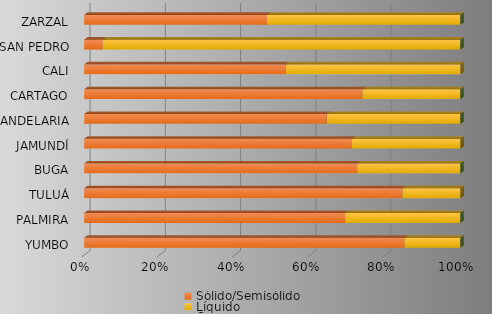
| Category | Sólido/Semisólido | Líquido | Gaseoso |
|---|---|---|---|
| YUMBO | 11409162.48 | 1994753.3 | 5 |
| PALMIRA | 1376159.92 | 608355.4 | 2.5 |
| TULUÁ | 463393.63 | 84497.25 | 0 |
| BUGA | 361998.75 | 136887.88 | 0 |
| JAMUNDÍ | 325955.24 | 132019.05 | 0 |
| CANDELARIA | 238635.66 | 131349.53 | 0 |
| CARTAGO | 162079.83 | 57181.8 | 0 |
| CALI | 108120.02 | 93927.56 | 0 |
| SAN PEDRO | 9124.11 | 176382 | 0 |
| ZARZAL | 79804.1 | 84428.75 | 0 |